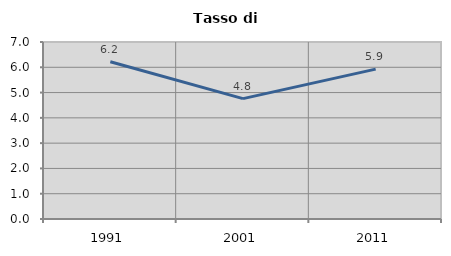
| Category | Tasso di disoccupazione   |
|---|---|
| 1991.0 | 6.219 |
| 2001.0 | 4.76 |
| 2011.0 | 5.926 |